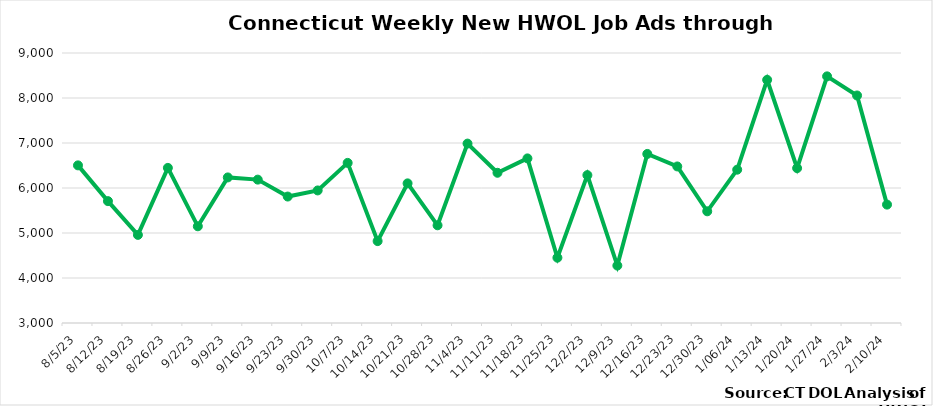
| Category | Connecticut |
|---|---|
| 8/5/23 | 6503 |
| 8/12/23 | 5708 |
| 8/19/23 | 4958 |
| 8/26/23 | 6447 |
| 9/2/23 | 5149 |
| 9/9/23 | 6235 |
| 9/16/23 | 6186 |
| 9/23/23 | 5810 |
| 9/30/23 | 5946 |
| 10/7/23 | 6558 |
| 10/14/23 | 4820 |
| 10/21/23 | 6103 |
| 10/28/23 | 5171 |
| 11/4/23 | 6987 |
| 11/11/23 | 6338 |
| 11/18/23 | 6658 |
| 11/25/23 | 4451 |
| 12/2/23 | 6286 |
| 12/9/23 | 4276 |
| 12/16/23 | 6757 |
|  12/23/23 | 6479 |
|  12/30/23 | 5482 |
|  1/06/24 | 6407 |
|  1/13/24 | 8403 |
|  1/20/24 | 6441 |
|  1/27/24 | 8481 |
|  2/3/24 | 8056 |
|  2/10/24 | 5631 |